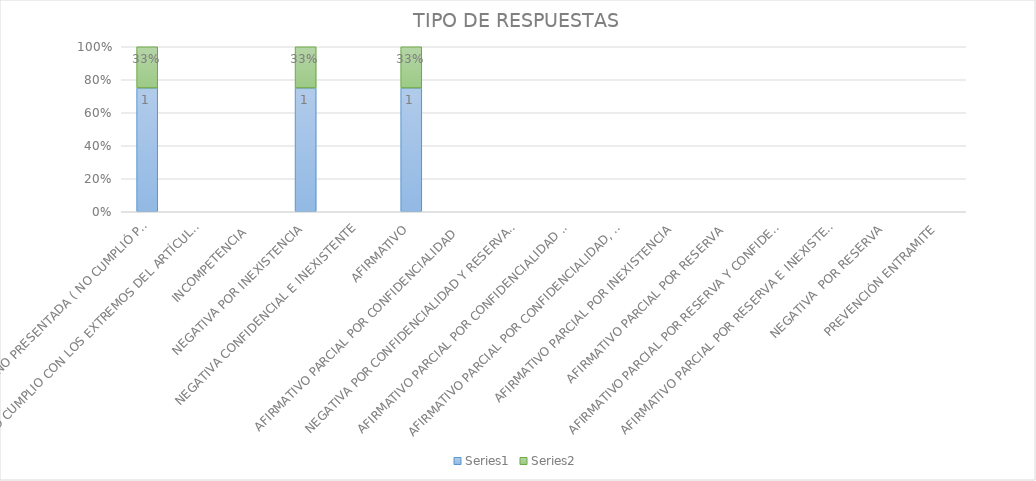
| Category | Series 4 | Series 5 |
|---|---|---|
| SE TIENE POR NO PRESENTADA ( NO CUMPLIÓ PREVENCIÓN) | 1 | 0.333 |
| NO CUMPLIO CON LOS EXTREMOS DEL ARTÍCULO 79 (REQUISITOS) | 0 | 0 |
| INCOMPETENCIA  | 0 | 0 |
| NEGATIVA POR INEXISTENCIA | 1 | 0.333 |
| NEGATIVA CONFIDENCIAL E INEXISTENTE | 0 | 0 |
| AFIRMATIVO | 1 | 0.333 |
| AFIRMATIVO PARCIAL POR CONFIDENCIALIDAD  | 0 | 0 |
| NEGATIVA POR CONFIDENCIALIDAD Y RESERVADA | 0 | 0 |
| AFIRMATIVO PARCIAL POR CONFIDENCIALIDAD E INEXISTENCIA | 0 | 0 |
| AFIRMATIVO PARCIAL POR CONFIDENCIALIDAD, RESERVA E INEXISTENCIA | 0 | 0 |
| AFIRMATIVO PARCIAL POR INEXISTENCIA | 0 | 0 |
| AFIRMATIVO PARCIAL POR RESERVA | 0 | 0 |
| AFIRMATIVO PARCIAL POR RESERVA Y CONFIDENCIALIDAD | 0 | 0 |
| AFIRMATIVO PARCIAL POR RESERVA E INEXISTENCIA | 0 | 0 |
| NEGATIVA  POR RESERVA | 0 | 0 |
| PREVENCIÓN ENTRAMITE | 0 | 0 |